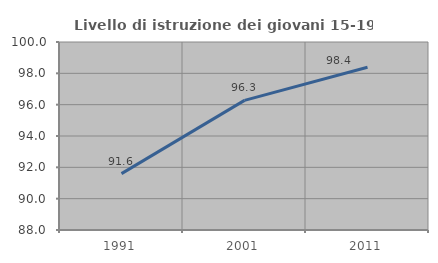
| Category | Livello di istruzione dei giovani 15-19 anni |
|---|---|
| 1991.0 | 91.596 |
| 2001.0 | 96.274 |
| 2011.0 | 98.389 |